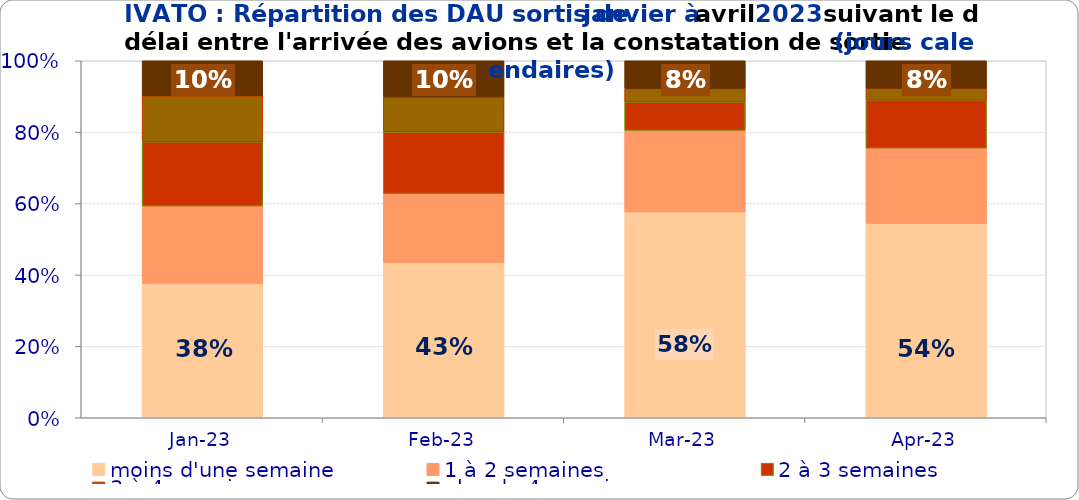
| Category | moins d'une semaine | 1 à 2 semaines | 2 à 3 semaines | 3 à 4 semaines | plus de 4 semaines |
|---|---|---|---|---|---|
| 2023-01-01 | 0.376 | 0.217 | 0.18 | 0.129 | 0.098 |
| 2023-02-01 | 0.434 | 0.194 | 0.173 | 0.098 | 0.102 |
| 2023-03-01 | 0.577 | 0.229 | 0.08 | 0.038 | 0.078 |
| 2023-04-01 | 0.544 | 0.211 | 0.134 | 0.034 | 0.077 |